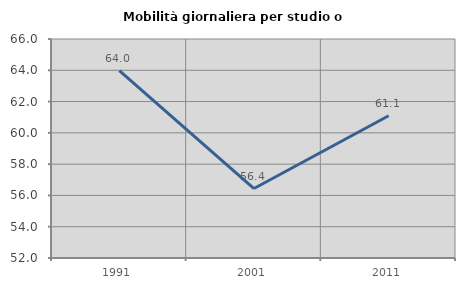
| Category | Mobilità giornaliera per studio o lavoro |
|---|---|
| 1991.0 | 63.975 |
| 2001.0 | 56.439 |
| 2011.0 | 61.096 |